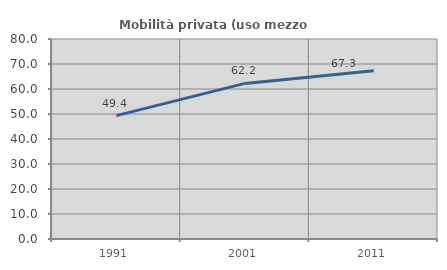
| Category | Mobilità privata (uso mezzo privato) |
|---|---|
| 1991.0 | 49.351 |
| 2001.0 | 62.245 |
| 2011.0 | 67.284 |